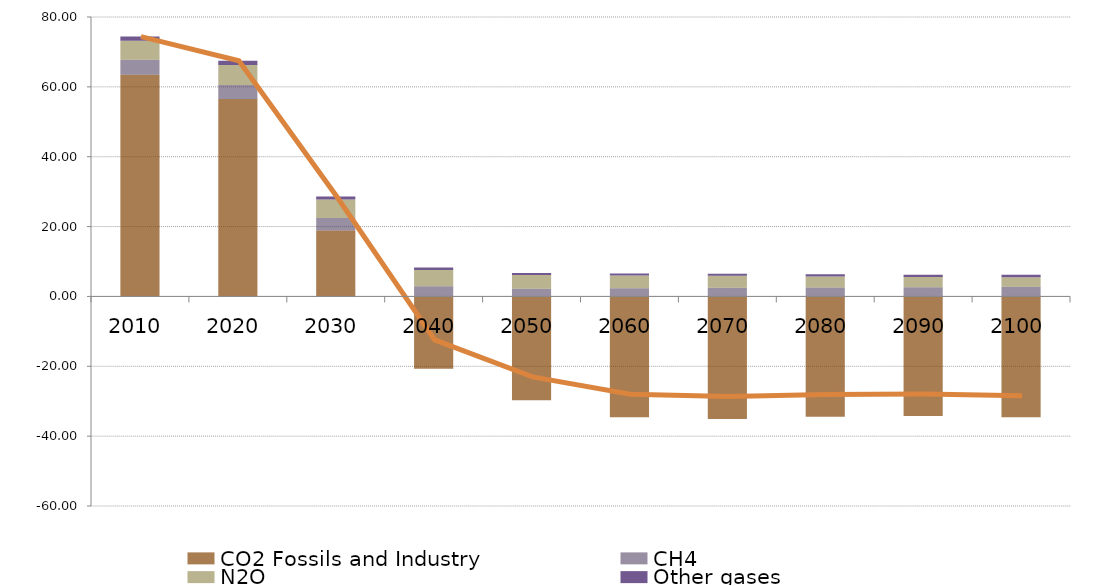
| Category | CO2 Fossils and Industry | CH4 | N2O | Other gases |
|---|---|---|---|---|
| 2010.0 | 63.488 | 4.265 | 5.438 | 1.205 |
| 2020.0 | 56.532 | 4.002 | 5.702 | 1.229 |
| 2030.0 | 18.892 | 3.573 | 5.307 | 0.842 |
| 2040.0 | -20.718 | 2.9 | 4.693 | 0.676 |
| 2050.0 | -29.744 | 2.216 | 3.903 | 0.579 |
| 2060.0 | -34.568 | 2.316 | 3.64 | 0.606 |
| 2070.0 | -35.123 | 2.464 | 3.421 | 0.618 |
| 2080.0 | -34.439 | 2.536 | 3.158 | 0.64 |
| 2090.0 | -34.2 | 2.655 | 2.895 | 0.681 |
| 2100.0 | -34.603 | 2.785 | 2.719 | 0.693 |